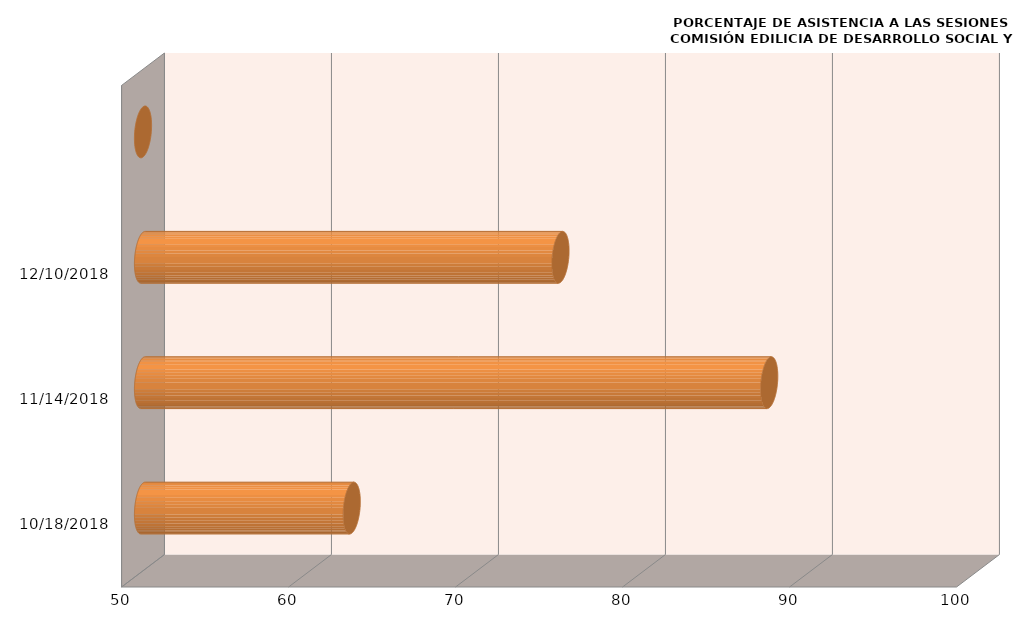
| Category | Series 0 |
|---|---|
| 10/18/18 | 62.5 |
| 11/14/18 | 87.5 |
| 12/10/18 | 75 |
| nan | 0 |